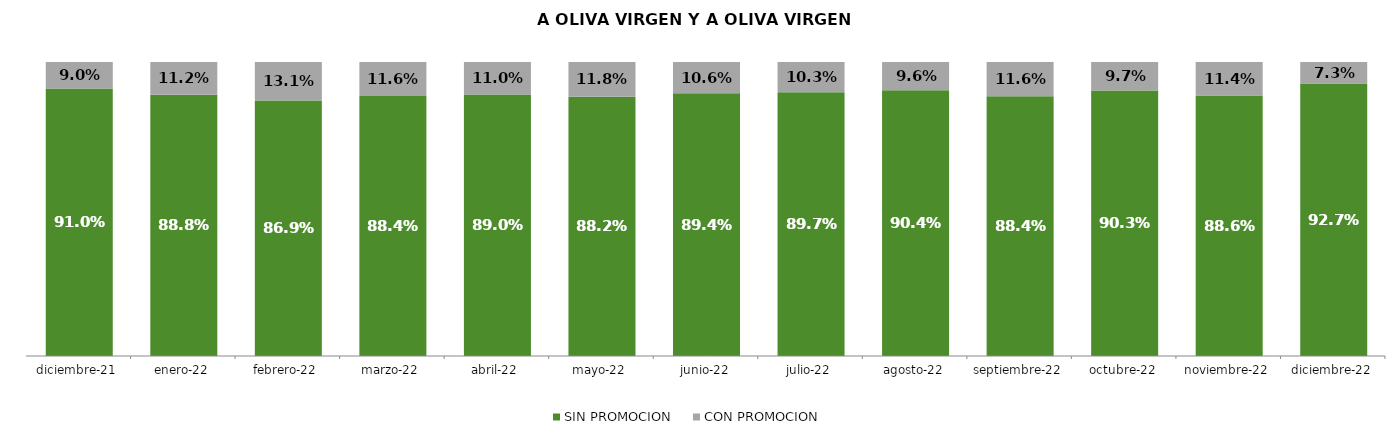
| Category | SIN PROMOCION   | CON PROMOCION   |
|---|---|---|
| 2021-12-01 | 0.91 | 0.09 |
| 2022-01-01 | 0.888 | 0.112 |
| 2022-02-01 | 0.869 | 0.131 |
| 2022-03-01 | 0.884 | 0.116 |
| 2022-04-01 | 0.89 | 0.11 |
| 2022-05-01 | 0.882 | 0.118 |
| 2022-06-01 | 0.894 | 0.106 |
| 2022-07-01 | 0.897 | 0.103 |
| 2022-08-01 | 0.904 | 0.096 |
| 2022-09-01 | 0.884 | 0.116 |
| 2022-10-01 | 0.903 | 0.097 |
| 2022-11-01 | 0.886 | 0.114 |
| 2022-12-01 | 0.927 | 0.073 |